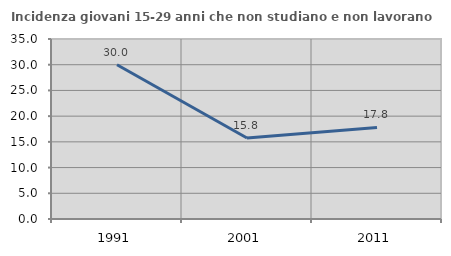
| Category | Incidenza giovani 15-29 anni che non studiano e non lavorano  |
|---|---|
| 1991.0 | 30 |
| 2001.0 | 15.756 |
| 2011.0 | 17.798 |